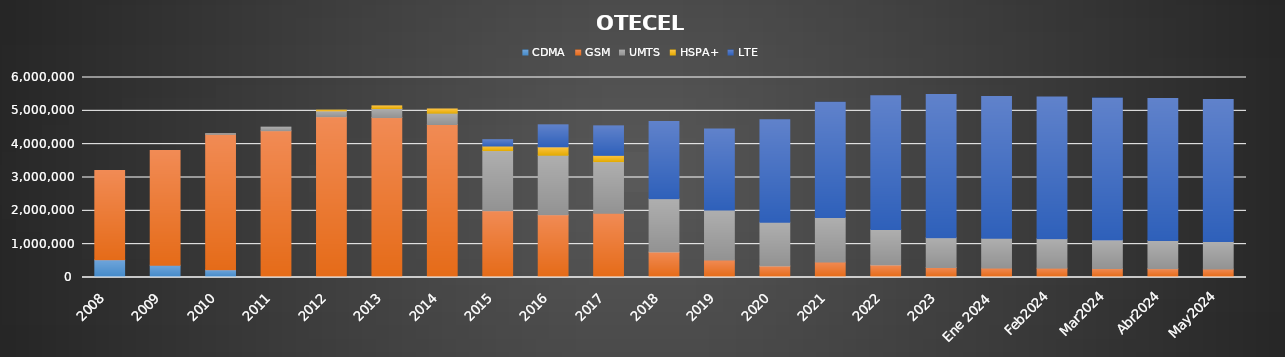
| Category | CDMA | GSM | UMTS | HSPA+ | LTE |
|---|---|---|---|---|---|
| 2008 | 533206 | 2678716 | 0 | 0 | 0 |
| 2009 | 370711 | 3435721 | 0 | 0 | 0 |
| 2010 | 232396 | 4061909 | 20294 | 0 | 0 |
| 2011 | 0 | 4403305 | 110569 | 0 | 0 |
| 2012 | 0 | 4823675 | 174375 | 21636 | 0 |
| 2013 | 0 | 4797632 | 272871 | 77805 | 0 |
| 2014 | 0 | 4589205 | 341647 | 124793 | 0 |
| 2015 | 0 | 2002436 | 1805322 | 136952 | 189988 |
| 2016 | 0 | 1881781 | 1787014 | 248541 | 662756 |
| 2017 | 0 | 1924184.634 | 1552693.066 | 187515.199 | 884631.101 |
| 2018 | 0 | 765658.891 | 1596404.415 | 0 | 2317582.694 |
| 2019 | 0 | 525011.505 | 1498097.705 | 0 | 2433246.79 |
| 2020 | 0 | 348601.621 | 1305745.099 | 0 | 3075378.28 |
| 2021 | 0 | 463116 | 1335075 | 0 | 3456277 |
| 2022 | 0 | 377030.536 | 1060440.283 | 0 | 4013644.181 |
| 2023 | 0 | 299210.551 | 896668.873 | 0 | 4293696.576 |
| Ene 2024 | 0 | 283602.743 | 890161.025 | 0 | 4253028.231 |
| Feb2024 | 0 | 281156.297 | 880092.083 | 0 | 4255374.62 |
| Mar2024 | 0 | 267820.732 | 857993.414 | 0 | 4255899.854 |
| Abr2024 | 0 | 264196.778 | 845534.153 | 0 | 4256590.069 |
| May2024 | 0 | 254498.082 | 823144.034 | 0 | 4262596.884 |